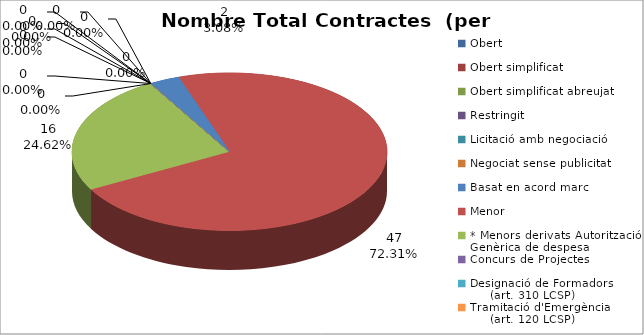
| Category | Nombre Total Contractes |
|---|---|
| Obert | 0 |
| Obert simplificat | 0 |
| Obert simplificat abreujat | 0 |
| Restringit | 0 |
| Licitació amb negociació | 0 |
| Negociat sense publicitat | 0 |
| Basat en acord marc | 2 |
| Menor | 47 |
| * Menors derivats Autorització Genèrica de despesa | 16 |
| Concurs de Projectes | 0 |
| Designació de Formadors
     (art. 310 LCSP) | 0 |
| Tramitació d'Emergència
     (art. 120 LCSP) | 0 |